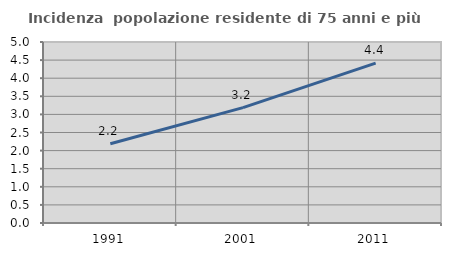
| Category | Incidenza  popolazione residente di 75 anni e più |
|---|---|
| 1991.0 | 2.19 |
| 2001.0 | 3.188 |
| 2011.0 | 4.416 |